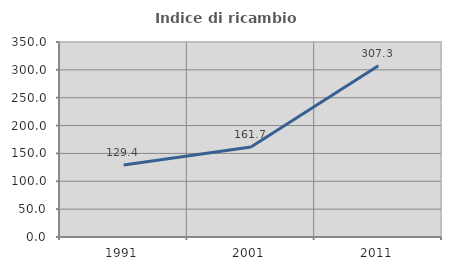
| Category | Indice di ricambio occupazionale  |
|---|---|
| 1991.0 | 129.388 |
| 2001.0 | 161.702 |
| 2011.0 | 307.258 |